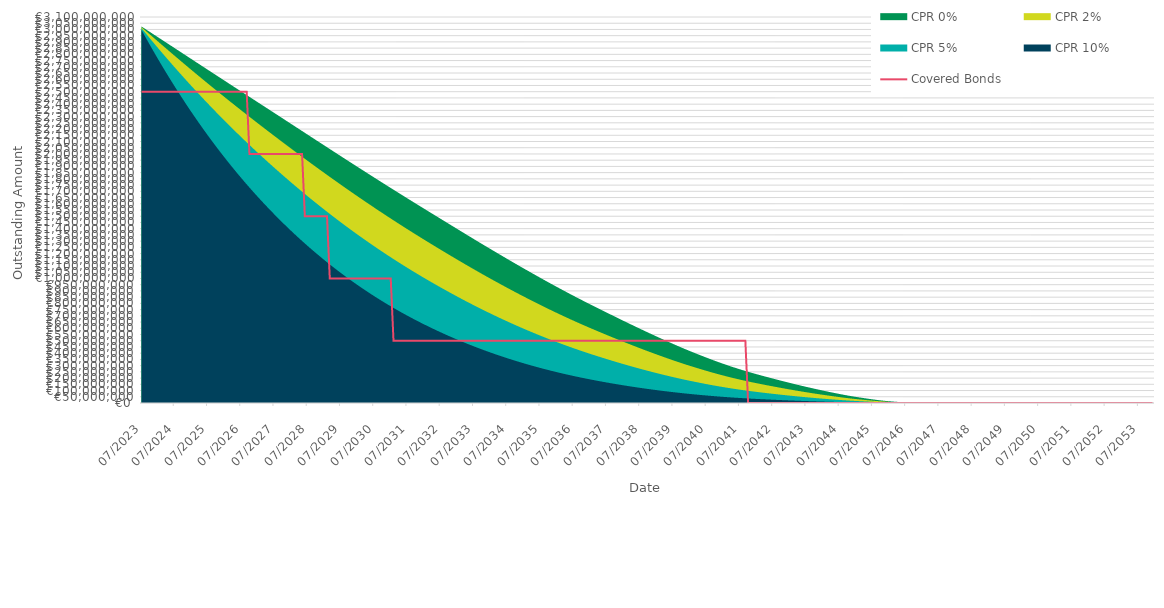
| Category | Covered Bonds |
|---|---|
| 2023-07-31 | 2500000000 |
| 2023-08-31 | 2500000000 |
| 2023-09-30 | 2500000000 |
| 2023-10-31 | 2500000000 |
| 2023-11-30 | 2500000000 |
| 2023-12-31 | 2500000000 |
| 2024-01-31 | 2500000000 |
| 2024-02-29 | 2500000000 |
| 2024-03-31 | 2500000000 |
| 2024-04-30 | 2500000000 |
| 2024-05-31 | 2500000000 |
| 2024-06-30 | 2500000000 |
| 2024-07-31 | 2500000000 |
| 2024-08-31 | 2500000000 |
| 2024-09-30 | 2500000000 |
| 2024-10-31 | 2500000000 |
| 2024-11-30 | 2500000000 |
| 2024-12-31 | 2500000000 |
| 2025-01-31 | 2500000000 |
| 2025-02-28 | 2500000000 |
| 2025-03-31 | 2500000000 |
| 2025-04-30 | 2500000000 |
| 2025-05-31 | 2500000000 |
| 2025-06-30 | 2500000000 |
| 2025-07-31 | 2500000000 |
| 2025-08-31 | 2500000000 |
| 2025-09-30 | 2500000000 |
| 2025-10-31 | 2500000000 |
| 2025-11-30 | 2500000000 |
| 2025-12-31 | 2500000000 |
| 2026-01-31 | 2500000000 |
| 2026-02-28 | 2500000000 |
| 2026-03-31 | 2500000000 |
| 2026-04-30 | 2500000000 |
| 2026-05-31 | 2500000000 |
| 2026-06-30 | 2500000000 |
| 2026-07-31 | 2500000000 |
| 2026-08-31 | 2500000000 |
| 2026-09-30 | 2500000000 |
| 2026-10-31 | 2000000000 |
| 2026-11-30 | 2000000000 |
| 2026-12-31 | 2000000000 |
| 2027-01-31 | 2000000000 |
| 2027-02-28 | 2000000000 |
| 2027-03-31 | 2000000000 |
| 2027-04-30 | 2000000000 |
| 2027-05-31 | 2000000000 |
| 2027-06-30 | 2000000000 |
| 2027-07-31 | 2000000000 |
| 2027-08-31 | 2000000000 |
| 2027-09-30 | 2000000000 |
| 2027-10-31 | 2000000000 |
| 2027-11-30 | 2000000000 |
| 2027-12-31 | 2000000000 |
| 2028-01-31 | 2000000000 |
| 2028-02-29 | 2000000000 |
| 2028-03-31 | 2000000000 |
| 2028-04-30 | 2000000000 |
| 2028-05-31 | 2000000000 |
| 2028-06-30 | 1500000000 |
| 2028-07-31 | 1500000000 |
| 2028-08-31 | 1500000000 |
| 2028-09-30 | 1500000000 |
| 2028-10-31 | 1500000000 |
| 2028-11-30 | 1500000000 |
| 2028-12-31 | 1500000000 |
| 2029-01-31 | 1500000000 |
| 2029-02-28 | 1500000000 |
| 2029-03-31 | 1000000000 |
| 2029-04-30 | 1000000000 |
| 2029-05-31 | 1000000000 |
| 2029-06-30 | 1000000000 |
| 2029-07-31 | 1000000000 |
| 2029-08-31 | 1000000000 |
| 2029-09-30 | 1000000000 |
| 2029-10-31 | 1000000000 |
| 2029-11-30 | 1000000000 |
| 2029-12-31 | 1000000000 |
| 2030-01-31 | 1000000000 |
| 2030-02-28 | 1000000000 |
| 2030-03-31 | 1000000000 |
| 2030-04-30 | 1000000000 |
| 2030-05-31 | 1000000000 |
| 2030-06-30 | 1000000000 |
| 2030-07-31 | 1000000000 |
| 2030-08-31 | 1000000000 |
| 2030-09-30 | 1000000000 |
| 2030-10-31 | 1000000000 |
| 2030-11-30 | 1000000000 |
| 2030-12-31 | 1000000000 |
| 2031-01-31 | 1000000000 |
| 2031-02-28 | 500000000 |
| 2031-03-31 | 500000000 |
| 2031-04-30 | 500000000 |
| 2031-05-31 | 500000000 |
| 2031-06-30 | 500000000 |
| 2031-07-31 | 500000000 |
| 2031-08-31 | 500000000 |
| 2031-09-30 | 500000000 |
| 2031-10-31 | 500000000 |
| 2031-11-30 | 500000000 |
| 2031-12-31 | 500000000 |
| 2032-01-31 | 500000000 |
| 2032-02-29 | 500000000 |
| 2032-03-31 | 500000000 |
| 2032-04-30 | 500000000 |
| 2032-05-31 | 500000000 |
| 2032-06-30 | 500000000 |
| 2032-07-31 | 500000000 |
| 2032-08-31 | 500000000 |
| 2032-09-30 | 500000000 |
| 2032-10-31 | 500000000 |
| 2032-11-30 | 500000000 |
| 2032-12-31 | 500000000 |
| 2033-01-31 | 500000000 |
| 2033-02-28 | 500000000 |
| 2033-03-31 | 500000000 |
| 2033-04-30 | 500000000 |
| 2033-05-31 | 500000000 |
| 2033-06-30 | 500000000 |
| 2033-07-31 | 500000000 |
| 2033-08-31 | 500000000 |
| 2033-09-30 | 500000000 |
| 2033-10-31 | 500000000 |
| 2033-11-30 | 500000000 |
| 2033-12-31 | 500000000 |
| 2034-01-31 | 500000000 |
| 2034-02-28 | 500000000 |
| 2034-03-31 | 500000000 |
| 2034-04-30 | 500000000 |
| 2034-05-31 | 500000000 |
| 2034-06-30 | 500000000 |
| 2034-07-31 | 500000000 |
| 2034-08-31 | 500000000 |
| 2034-09-30 | 500000000 |
| 2034-10-31 | 500000000 |
| 2034-11-30 | 500000000 |
| 2034-12-31 | 500000000 |
| 2035-01-31 | 500000000 |
| 2035-02-28 | 500000000 |
| 2035-03-31 | 500000000 |
| 2035-04-30 | 500000000 |
| 2035-05-31 | 500000000 |
| 2035-06-30 | 500000000 |
| 2035-07-31 | 500000000 |
| 2035-08-31 | 500000000 |
| 2035-09-30 | 500000000 |
| 2035-10-31 | 500000000 |
| 2035-11-30 | 500000000 |
| 2035-12-31 | 500000000 |
| 2036-01-31 | 500000000 |
| 2036-02-29 | 500000000 |
| 2036-03-31 | 500000000 |
| 2036-04-30 | 500000000 |
| 2036-05-31 | 500000000 |
| 2036-06-30 | 500000000 |
| 2036-07-31 | 500000000 |
| 2036-08-31 | 500000000 |
| 2036-09-30 | 500000000 |
| 2036-10-31 | 500000000 |
| 2036-11-30 | 500000000 |
| 2036-12-31 | 500000000 |
| 2037-01-31 | 500000000 |
| 2037-02-28 | 500000000 |
| 2037-03-31 | 500000000 |
| 2037-04-30 | 500000000 |
| 2037-05-31 | 500000000 |
| 2037-06-30 | 500000000 |
| 2037-07-31 | 500000000 |
| 2037-08-31 | 500000000 |
| 2037-09-30 | 500000000 |
| 2037-10-31 | 500000000 |
| 2037-11-30 | 500000000 |
| 2037-12-31 | 500000000 |
| 2038-01-31 | 500000000 |
| 2038-02-28 | 500000000 |
| 2038-03-31 | 500000000 |
| 2038-04-30 | 500000000 |
| 2038-05-31 | 500000000 |
| 2038-06-30 | 500000000 |
| 2038-07-31 | 500000000 |
| 2038-08-31 | 500000000 |
| 2038-09-30 | 500000000 |
| 2038-10-31 | 500000000 |
| 2038-11-30 | 500000000 |
| 2038-12-31 | 500000000 |
| 2039-01-31 | 500000000 |
| 2039-02-28 | 500000000 |
| 2039-03-31 | 500000000 |
| 2039-04-30 | 500000000 |
| 2039-05-31 | 500000000 |
| 2039-06-30 | 500000000 |
| 2039-07-31 | 500000000 |
| 2039-08-31 | 500000000 |
| 2039-09-30 | 500000000 |
| 2039-10-31 | 500000000 |
| 2039-11-30 | 500000000 |
| 2039-12-31 | 500000000 |
| 2040-01-31 | 500000000 |
| 2040-02-29 | 500000000 |
| 2040-03-31 | 500000000 |
| 2040-04-30 | 500000000 |
| 2040-05-31 | 500000000 |
| 2040-06-30 | 500000000 |
| 2040-07-31 | 500000000 |
| 2040-08-31 | 500000000 |
| 2040-09-30 | 500000000 |
| 2040-10-31 | 500000000 |
| 2040-11-30 | 500000000 |
| 2040-12-31 | 500000000 |
| 2041-01-31 | 500000000 |
| 2041-02-28 | 500000000 |
| 2041-03-31 | 500000000 |
| 2041-04-30 | 500000000 |
| 2041-05-31 | 500000000 |
| 2041-06-30 | 500000000 |
| 2041-07-31 | 500000000 |
| 2041-08-31 | 500000000 |
| 2041-09-30 | 500000000 |
| 2041-10-31 | 0 |
| 2041-11-30 | 0 |
| 2041-12-31 | 0 |
| 2042-01-31 | 0 |
| 2042-02-28 | 0 |
| 2042-03-31 | 0 |
| 2042-04-30 | 0 |
| 2042-05-31 | 0 |
| 2042-06-30 | 0 |
| 2042-07-31 | 0 |
| 2042-08-31 | 0 |
| 2042-09-30 | 0 |
| 2042-10-31 | 0 |
| 2042-11-30 | 0 |
| 2042-12-31 | 0 |
| 2043-01-31 | 0 |
| 2043-02-28 | 0 |
| 2043-03-31 | 0 |
| 2043-04-30 | 0 |
| 2043-05-31 | 0 |
| 2043-06-30 | 0 |
| 2043-07-31 | 0 |
| 2043-08-31 | 0 |
| 2043-09-30 | 0 |
| 2043-10-31 | 0 |
| 2043-11-30 | 0 |
| 2043-12-31 | 0 |
| 2044-01-31 | 0 |
| 2044-02-29 | 0 |
| 2044-03-31 | 0 |
| 2044-04-30 | 0 |
| 2044-05-31 | 0 |
| 2044-06-30 | 0 |
| 2044-07-31 | 0 |
| 2044-08-31 | 0 |
| 2044-09-30 | 0 |
| 2044-10-31 | 0 |
| 2044-11-30 | 0 |
| 2044-12-31 | 0 |
| 2045-01-31 | 0 |
| 2045-02-28 | 0 |
| 2045-03-31 | 0 |
| 2045-04-30 | 0 |
| 2045-05-31 | 0 |
| 2045-06-30 | 0 |
| 2045-07-31 | 0 |
| 2045-08-31 | 0 |
| 2045-09-30 | 0 |
| 2045-10-31 | 0 |
| 2045-11-30 | 0 |
| 2045-12-31 | 0 |
| 2046-01-31 | 0 |
| 2046-02-28 | 0 |
| 2046-03-31 | 0 |
| 2046-04-30 | 0 |
| 2046-05-31 | 0 |
| 2046-06-30 | 0 |
| 2046-07-31 | 0 |
| 2046-08-31 | 0 |
| 2046-09-30 | 0 |
| 2046-10-31 | 0 |
| 2046-11-30 | 0 |
| 2046-12-31 | 0 |
| 2047-01-31 | 0 |
| 2047-02-28 | 0 |
| 2047-03-31 | 0 |
| 2047-04-30 | 0 |
| 2047-05-31 | 0 |
| 2047-06-30 | 0 |
| 2047-07-31 | 0 |
| 2047-08-31 | 0 |
| 2047-09-30 | 0 |
| 2047-10-31 | 0 |
| 2047-11-30 | 0 |
| 2047-12-31 | 0 |
| 2048-01-31 | 0 |
| 2048-02-29 | 0 |
| 2048-03-31 | 0 |
| 2048-04-30 | 0 |
| 2048-05-31 | 0 |
| 2048-06-30 | 0 |
| 2048-07-31 | 0 |
| 2048-08-31 | 0 |
| 2048-09-30 | 0 |
| 2048-10-31 | 0 |
| 2048-11-30 | 0 |
| 2048-12-31 | 0 |
| 2049-01-31 | 0 |
| 2049-02-28 | 0 |
| 2049-03-31 | 0 |
| 2049-04-30 | 0 |
| 2049-05-31 | 0 |
| 2049-06-30 | 0 |
| 2049-07-31 | 0 |
| 2049-08-31 | 0 |
| 2049-09-30 | 0 |
| 2049-10-31 | 0 |
| 2049-11-30 | 0 |
| 2049-12-31 | 0 |
| 2050-01-31 | 0 |
| 2050-02-28 | 0 |
| 2050-03-31 | 0 |
| 2050-04-30 | 0 |
| 2050-05-31 | 0 |
| 2050-06-30 | 0 |
| 2050-07-31 | 0 |
| 2050-08-31 | 0 |
| 2050-09-30 | 0 |
| 2050-10-31 | 0 |
| 2050-11-30 | 0 |
| 2050-12-31 | 0 |
| 2051-01-31 | 0 |
| 2051-02-28 | 0 |
| 2051-03-31 | 0 |
| 2051-04-30 | 0 |
| 2051-05-31 | 0 |
| 2051-06-30 | 0 |
| 2051-07-31 | 0 |
| 2051-08-31 | 0 |
| 2051-09-30 | 0 |
| 2051-10-31 | 0 |
| 2051-11-30 | 0 |
| 2051-12-31 | 0 |
| 2052-01-31 | 0 |
| 2052-02-29 | 0 |
| 2052-03-31 | 0 |
| 2052-04-30 | 0 |
| 2052-05-31 | 0 |
| 2052-06-30 | 0 |
| 2052-07-31 | 0 |
| 2052-08-31 | 0 |
| 2052-09-30 | 0 |
| 2052-10-31 | 0 |
| 2052-11-30 | 0 |
| 2052-12-31 | 0 |
| 2053-01-31 | 0 |
| 2053-02-28 | 0 |
| 2053-03-31 | 0 |
| 2053-04-30 | 0 |
| 2053-05-31 | 0 |
| 2053-06-30 | 0 |
| 2053-07-31 | 0 |
| 2053-08-31 | 0 |
| 2053-09-30 | 0 |
| 2053-10-31 | 0 |
| 2053-11-30 | 0 |
| 2053-12-31 | 0 |